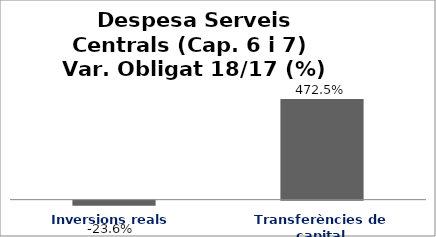
| Category | Series 0 |
|---|---|
| Inversions reals | -0.236 |
| Transferències de capital | 4.725 |